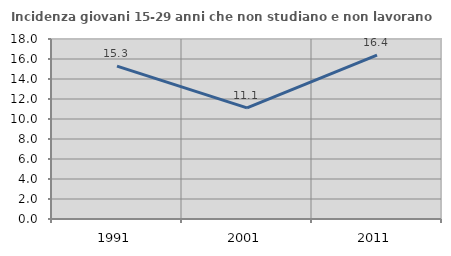
| Category | Incidenza giovani 15-29 anni che non studiano e non lavorano  |
|---|---|
| 1991.0 | 15.282 |
| 2001.0 | 11.111 |
| 2011.0 | 16.381 |